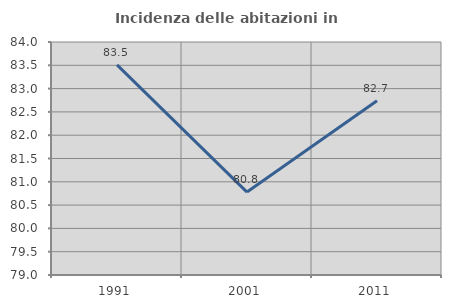
| Category | Incidenza delle abitazioni in proprietà  |
|---|---|
| 1991.0 | 83.511 |
| 2001.0 | 80.78 |
| 2011.0 | 82.74 |